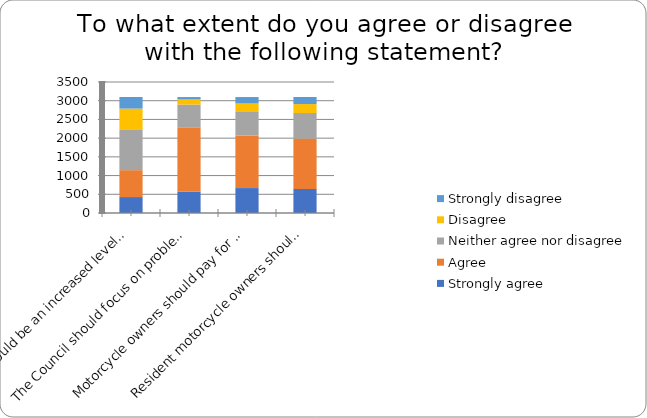
| Category | Strongly agree | Agree | Neither agree nor disagree | Disagree | Strongly disagree |
|---|---|---|---|---|---|
| There should be an increased level of parking enforcement. | 426 | 719 | 1074 | 570 | 310 |
| The Council should focus on problem parking areas and deploy fewer officers where people are more likely to park legally. | 574 | 1702 | 621 | 136 | 65 |
| Motorcycle owners should pay for parking in car parks and pay and display bays. | 666 | 1405 | 628 | 227 | 172 |
| Resident motorcycle owners should have to buy resident parking permits. | 643 | 1346 | 682 | 239 | 189 |